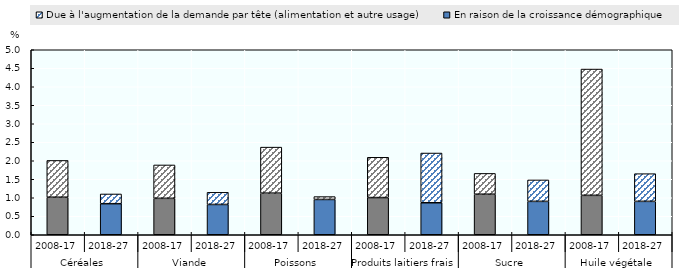
| Category | En raison de la croissance démographique | Due à l'augmentation de la demande par tête (alimentation et autre usage) |
|---|---|---|
| 0 | 1.015 | 0.994 |
| 1 | 0.84 | 0.262 |
| 2 | 0.985 | 0.902 |
| 3 | 0.818 | 0.329 |
| 4 | 1.125 | 1.243 |
| 5 | 0.954 | 0.077 |
| 6 | 1.005 | 1.089 |
| 7 | 0.865 | 1.344 |
| 8 | 1.096 | 0.562 |
| 9 | 0.902 | 0.58 |
| 10 | 1.065 | 3.413 |
| 11 | 0.903 | 0.748 |